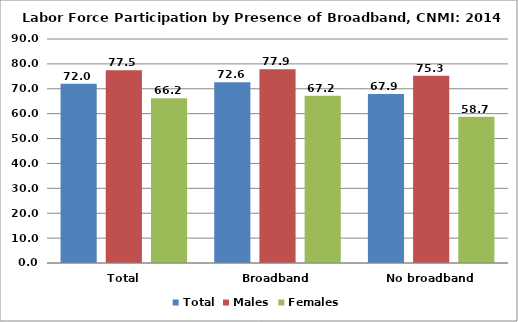
| Category | Total | Males | Females |
|---|---|---|---|
| Total | 71.997 | 77.481 | 66.178 |
| Broadband | 72.639 | 77.85 | 67.239 |
| No broadband | 67.91 | 75.258 | 58.717 |